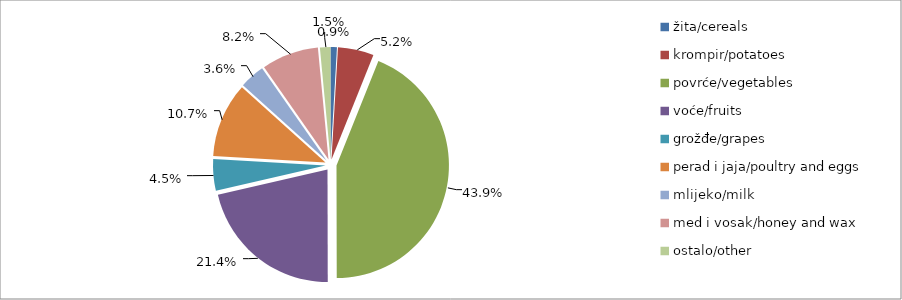
| Category | Series 0 |
|---|---|
| žita/cereals | 14080 |
| krompir/potatoes | 78998 |
| povrće/vegetables | 672597.5 |
| voće/fruits | 328208.5 |
| grožđe/grapes | 69595 |
| perad i jaja/poultry and eggs | 164721.5 |
| mlijeko/milk | 55433 |
| med i vosak/honey and wax | 125635 |
| ostalo/other | 23100 |